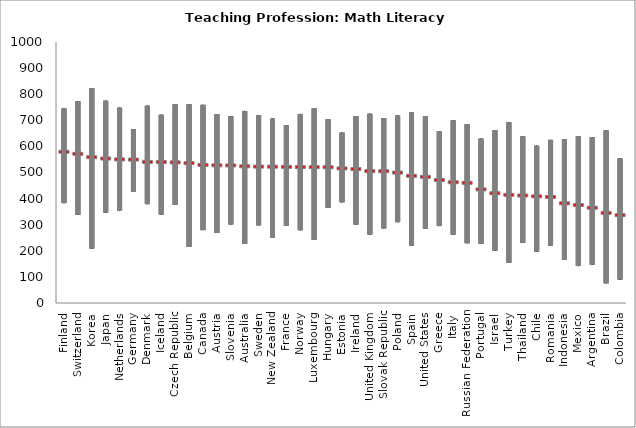
| Category | min | mean | max |
|---|---|---|---|
| Finland | 382.824 | 581.413 | 744.75 |
| Switzerland | 338.238 | 573.44 | 773.166 |
| Korea | 208.638 | 560.684 | 823.298 |
| Japan | 346.869 | 555.439 | 774.692 |
| Netherlands | 354.954 | 552.035 | 747.944 |
| Germany | 425.292 | 551.44 | 665.516 |
| Denmark | 378.914 | 542.585 | 755.64 |
| Iceland | 339.406 | 541.942 | 721.086 |
| Czech Republic | 375.783 | 540.67 | 762.136 |
| Belgium | 214.745 | 537.874 | 761.061 |
| Canada | 279.397 | 530.823 | 759.067 |
| Austria | 268.227 | 529.391 | 723.656 |
| Slovenia | 301.379 | 529.02 | 715.337 |
| Australia | 226.118 | 525.657 | 736.057 |
| Sweden | 297.936 | 524.453 | 719.699 |
| New Zealand | 249.174 | 524.334 | 706.286 |
| France | 295.178 | 523.634 | 681.531 |
| Norway | 279.008 | 522.593 | 724.264 |
| Luxembourg | 242.413 | 522.552 | 744.812 |
| Hungary | 365.298 | 522.017 | 704.853 |
| Estonia | 386.221 | 517.548 | 652.508 |
| Ireland | 300.865 | 515.069 | 716.334 |
| United Kingdom | 262.634 | 507.187 | 725.012 |
| Slovak Republic | 286.096 | 506.81 | 707.969 |
| Poland | 309.869 | 501.569 | 718.188 |
| Spain | 218.796 | 489.327 | 729.576 |
| United States | 283.946 | 485.369 | 716.147 |
| Greece | 294.882 | 473.01 | 658.662 |
| Italy | 262.151 | 464.59 | 699.805 |
| Russian Federation | 229.265 | 462.341 | 684.756 |
| Portugal | 226.928 | 437.126 | 629.467 |
| Israel | 200.88 | 422.365 | 661.746 |
| Turkey | 154.642 | 416.29 | 691.471 |
| Thailand | 230.776 | 413.85 | 638.518 |
| Chile | 197.141 | 410.543 | 602.407 |
| Romania | 219.886 | 408.459 | 624.872 |
| Indonesia | 164.769 | 383.636 | 626.648 |
| Mexico | 141.4 | 377.25 | 639.313 |
| Argentina | 147.336 | 366.969 | 634.39 |
| Brazil | 75.939 | 347.183 | 660.967 |
| Colombia | 90.037 | 338.436 | 553.427 |